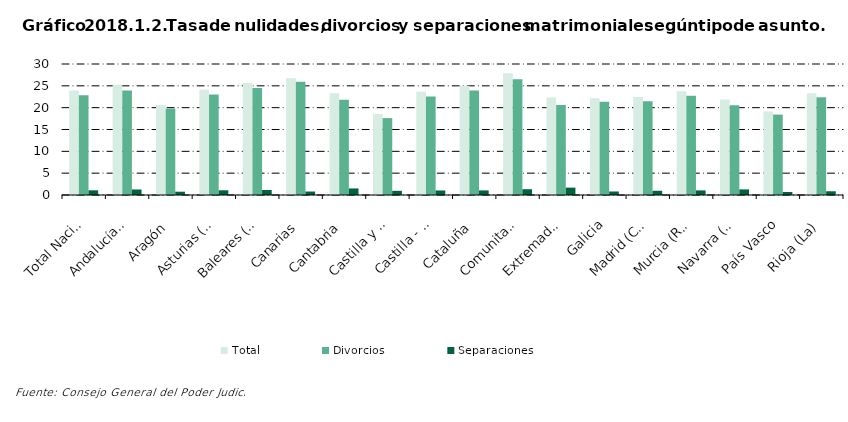
| Category | Total | Divorcios | Separaciones |
|---|---|---|---|
| Total Nacional | 23.936 | 22.831 | 1.077 |
| Andalucía(1) | 25.248 | 23.949 | 1.265 |
| Aragón | 20.608 | 19.828 | 0.756 |
| Asturias (Principado de) | 24.109 | 23.02 | 1.08 |
| Baleares (Illes) | 25.662 | 24.484 | 1.143 |
| Canarias | 26.747 | 25.93 | 0.794 |
| Cantabria | 23.318 | 21.819 | 1.499 |
| Castilla y León | 18.583 | 17.608 | 0.959 |
| Castilla - La Mancha | 23.618 | 22.538 | 1.036 |
| Cataluña | 25.013 | 23.916 | 1.054 |
| Comunitat Valenciana | 27.866 | 26.506 | 1.324 |
| Extremadura | 22.314 | 20.618 | 1.687 |
| Galicia | 22.16 | 21.331 | 0.807 |
| Madrid (Comunidad de) | 22.438 | 21.45 | 0.968 |
| Murcia (Región de) | 23.774 | 22.712 | 1.055 |
| Navarra (Comunidad Foral de) | 21.867 | 20.57 | 1.282 |
| País Vasco | 19.126 | 18.417 | 0.691 |
| Rioja (La) | 23.283 | 22.365 | 0.855 |